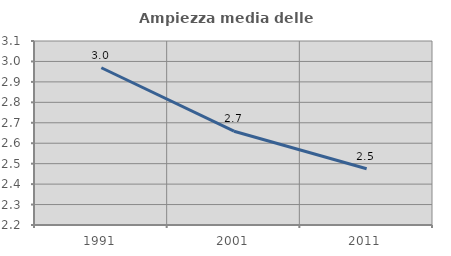
| Category | Ampiezza media delle famiglie |
|---|---|
| 1991.0 | 2.969 |
| 2001.0 | 2.659 |
| 2011.0 | 2.475 |